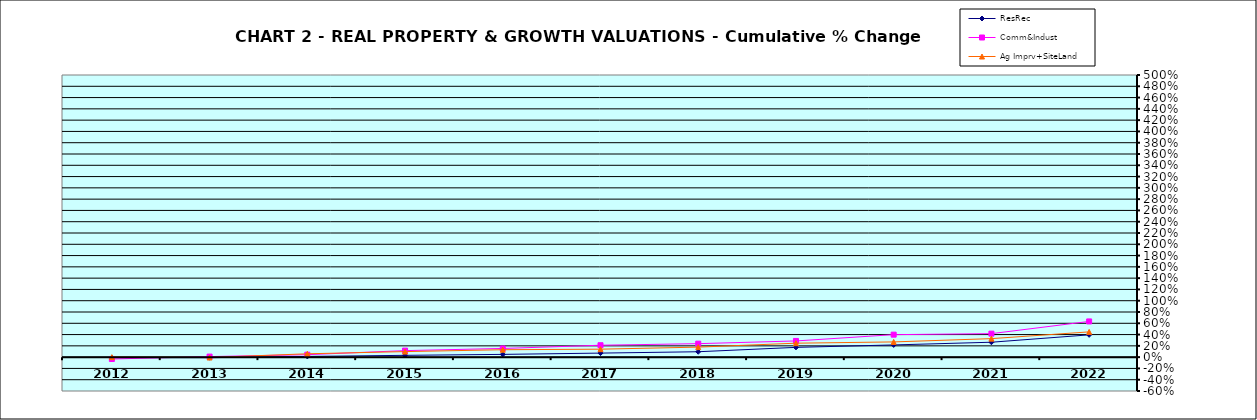
| Category | ResRec | Comm&Indust | Ag Imprv+SiteLand |
|---|---|---|---|
| 2012.0 | -0.008 | -0.033 | 0 |
| 2013.0 | -0.009 | 0.01 | -0.006 |
| 2014.0 | 0.013 | 0.044 | 0.059 |
| 2015.0 | 0.032 | 0.116 | 0.098 |
| 2016.0 | 0.049 | 0.154 | 0.131 |
| 2017.0 | 0.072 | 0.211 | 0.141 |
| 2018.0 | 0.096 | 0.239 | 0.178 |
| 2019.0 | 0.173 | 0.287 | 0.247 |
| 2020.0 | 0.216 | 0.399 | 0.27 |
| 2021.0 | 0.264 | 0.416 | 0.328 |
| 2022.0 | 0.395 | 0.633 | 0.448 |